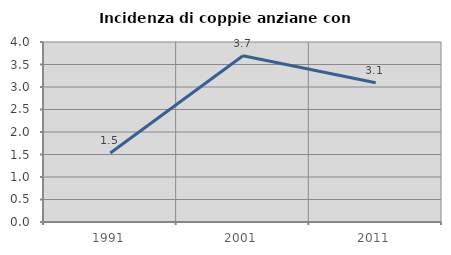
| Category | Incidenza di coppie anziane con figli |
|---|---|
| 1991.0 | 1.533 |
| 2001.0 | 3.694 |
| 2011.0 | 3.093 |